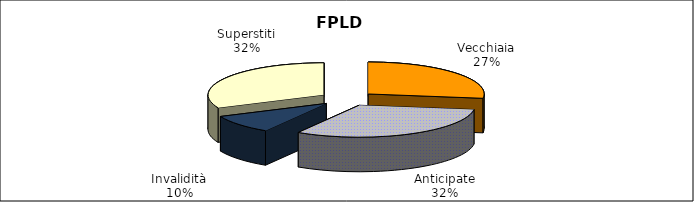
| Category | Series 0 |
|---|---|
| Vecchiaia | 88968 |
| Anticipate | 103615 |
| Invalidità | 31238 |
| Superstiti | 103737 |